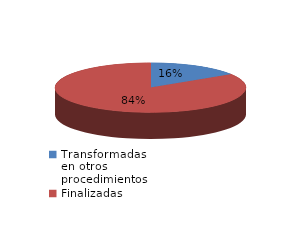
| Category | Series 0 |
|---|---|
| Transformadas en otros procedimientos | 4620 |
| Finalizadas | 24654 |